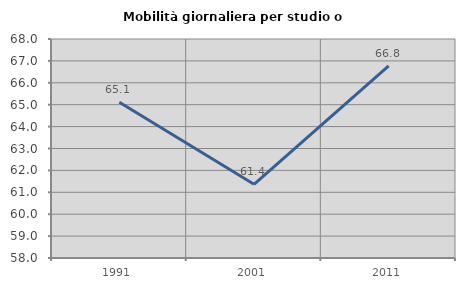
| Category | Mobilità giornaliera per studio o lavoro |
|---|---|
| 1991.0 | 65.115 |
| 2001.0 | 61.367 |
| 2011.0 | 66.778 |